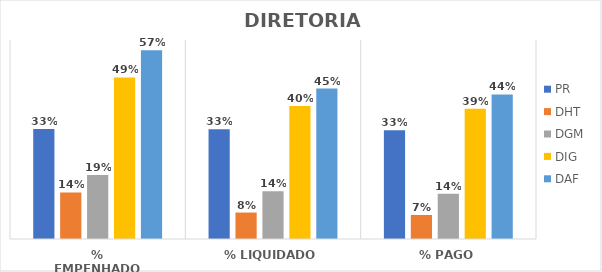
| Category | PR | DHT | DGM | DIG | DAF |
|---|---|---|---|---|---|
| % EMPENHADO | 0.332 | 0.14 | 0.193 | 0.487 | 0.569 |
| % LIQUIDADO | 0.331 | 0.08 | 0.144 | 0.401 | 0.453 |
| % PAGO | 0.328 | 0.072 | 0.136 | 0.393 | 0.436 |